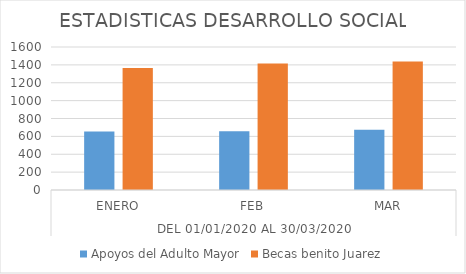
| Category | Apoyos del Adulto Mayor | Becas benito Juarez |
|---|---|---|
| 0 | 655 | 1365 |
| 1 | 658 | 1415 |
| 2 | 675 | 1438 |